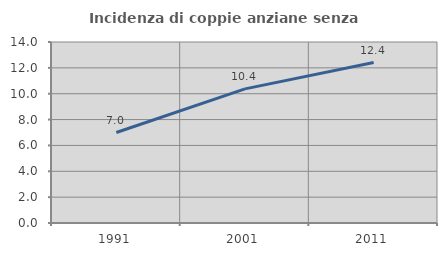
| Category | Incidenza di coppie anziane senza figli  |
|---|---|
| 1991.0 | 6.997 |
| 2001.0 | 10.373 |
| 2011.0 | 12.412 |